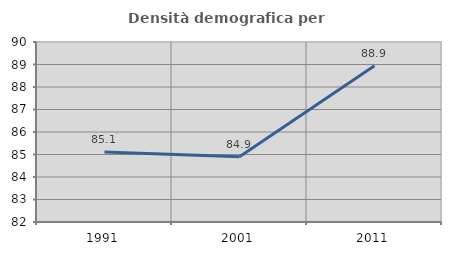
| Category | Densità demografica |
|---|---|
| 1991.0 | 85.11 |
| 2001.0 | 84.903 |
| 2011.0 | 88.946 |